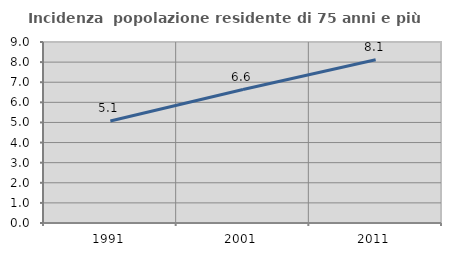
| Category | Incidenza  popolazione residente di 75 anni e più |
|---|---|
| 1991.0 | 5.07 |
| 2001.0 | 6.635 |
| 2011.0 | 8.116 |